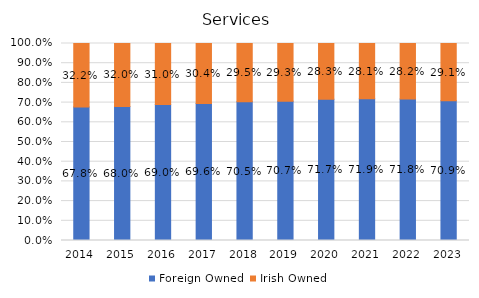
| Category | Foreign Owned | Irish Owned |
|---|---|---|
| 2014.0 | 0.678 | 0.322 |
| 2015.0 | 0.68 | 0.32 |
| 2016.0 | 0.69 | 0.31 |
| 2017.0 | 0.696 | 0.304 |
| 2018.0 | 0.705 | 0.295 |
| 2019.0 | 0.707 | 0.293 |
| 2020.0 | 0.717 | 0.283 |
| 2021.0 | 0.719 | 0.281 |
| 2022.0 | 0.718 | 0.282 |
| 2023.0 | 0.709 | 0.291 |